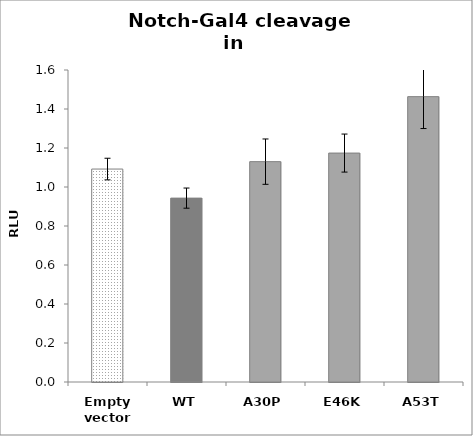
| Category | Series 0 |
|---|---|
| Empty vector | 1.092 |
| WT | 0.943 |
| A30P | 1.13 |
| E46K | 1.174 |
| A53T | 1.463 |